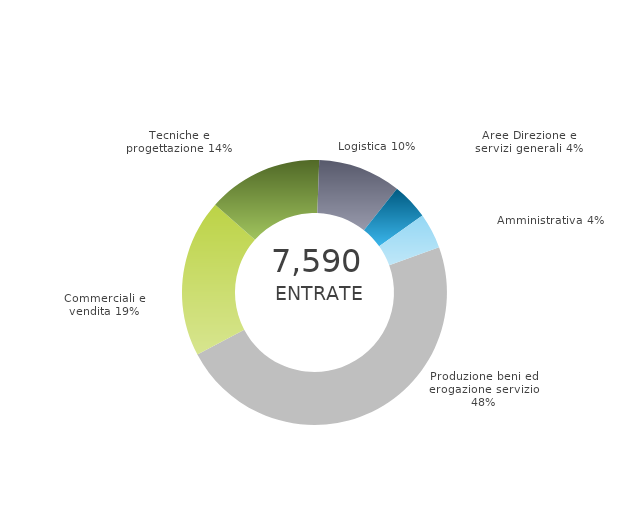
| Category | Series 0 | Series 1 |
|---|---|---|
| Produzione beni ed erogazione servizio | 0 | 0.478 |
| Commerciali e vendita | 0 | 0.193 |
| Tecniche e progettazione | 0 | 0.141 |
| Logistica | 0 | 0.101 |
| Aree Direzione e servizi generali | 0 | 0.045 |
| Amministrativa | 0 | 0.043 |